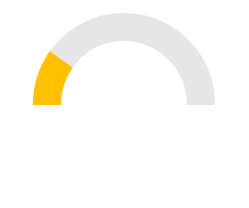
| Category | Series 0 |
|---|---|
| 0 | 0.1 |
| 1 | 0.4 |
| 2 | 0.5 |